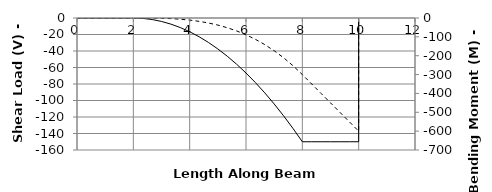
| Category | V |
|---|---|
| 0.0 | 0 |
| 0.0 | 0 |
| 0.3333333333333333 | 0 |
| 0.6666666666666666 | 0 |
| 1.0 | 0 |
| 1.3333333333333333 | 0 |
| 1.6666666666666665 | 0 |
| 2.0 | 0 |
| 2.0 | 0 |
| 2.333333333333333 | -0.463 |
| 2.6666666666666665 | -1.852 |
| 3.0 | -4.167 |
| 3.333333333333333 | -7.407 |
| 3.6666666666666665 | -11.574 |
| 4.0 | -16.667 |
| 4.333333333333333 | -22.685 |
| 4.666666666666666 | -29.63 |
| 5.0 | -37.5 |
| 5.333333333333333 | -46.296 |
| 5.666666666666666 | -56.019 |
| 6.0 | -66.667 |
| 6.333333333333333 | -78.241 |
| 6.666666666666666 | -90.741 |
| 7.0 | -104.167 |
| 7.333333333333333 | -118.519 |
| 7.666666666666666 | -133.796 |
| 8.0 | -150 |
| 8.0 | -150 |
| 8.333333333333332 | -150 |
| 8.666666666666666 | -150 |
| 9.0 | -150 |
| 9.333333333333332 | -150 |
| 9.666666666666666 | -150 |
| 10.0 | -150 |
| 10.0 | 0 |